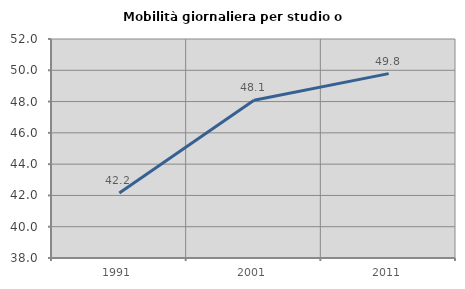
| Category | Mobilità giornaliera per studio o lavoro |
|---|---|
| 1991.0 | 42.16 |
| 2001.0 | 48.08 |
| 2011.0 | 49.787 |